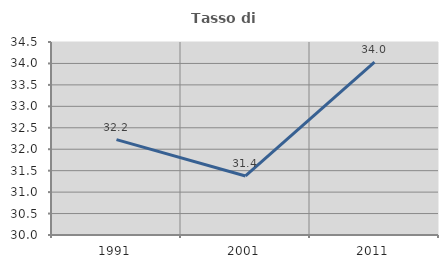
| Category | Tasso di occupazione   |
|---|---|
| 1991.0 | 32.223 |
| 2001.0 | 31.376 |
| 2011.0 | 34.029 |